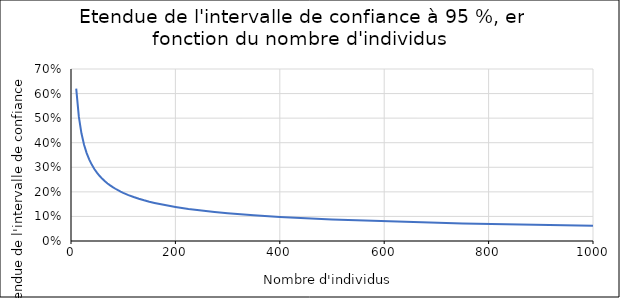
| Category | Etendue 
de l'IC95 |
|---|---|
| 10.0 | 0.62 |
| 15.0 | 0.506 |
| 20.0 | 0.438 |
| 25.0 | 0.392 |
| 30.0 | 0.358 |
| 35.0 | 0.331 |
| 40.0 | 0.31 |
| 45.0 | 0.292 |
| 50.0 | 0.277 |
| 55.0 | 0.264 |
| 60.0 | 0.253 |
| 65.0 | 0.243 |
| 70.0 | 0.234 |
| 75.0 | 0.226 |
| 80.0 | 0.219 |
| 85.0 | 0.213 |
| 90.0 | 0.207 |
| 95.0 | 0.201 |
| 100.0 | 0.196 |
| 110.0 | 0.187 |
| 120.0 | 0.179 |
| 130.0 | 0.172 |
| 140.0 | 0.166 |
| 150.0 | 0.16 |
| 160.0 | 0.155 |
| 170.0 | 0.15 |
| 180.0 | 0.146 |
| 190.0 | 0.142 |
| 200.0 | 0.139 |
| 225.0 | 0.131 |
| 250.0 | 0.124 |
| 275.0 | 0.118 |
| 300.0 | 0.113 |
| 350.0 | 0.105 |
| 400.0 | 0.098 |
| 500.0 | 0.088 |
| 750.0 | 0.072 |
| 1000.0 | 0.062 |